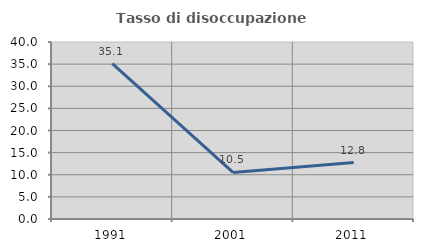
| Category | Tasso di disoccupazione giovanile  |
|---|---|
| 1991.0 | 35.106 |
| 2001.0 | 10.526 |
| 2011.0 | 12.766 |